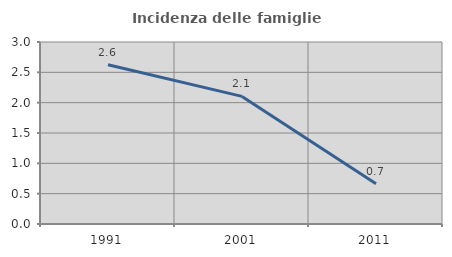
| Category | Incidenza delle famiglie numerose |
|---|---|
| 1991.0 | 2.626 |
| 2001.0 | 2.103 |
| 2011.0 | 0.664 |